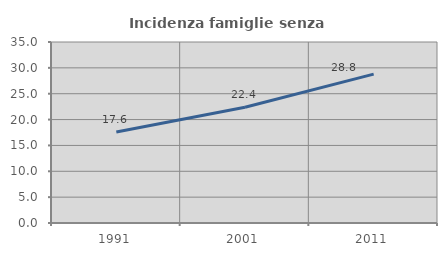
| Category | Incidenza famiglie senza nuclei |
|---|---|
| 1991.0 | 17.591 |
| 2001.0 | 22.388 |
| 2011.0 | 28.78 |